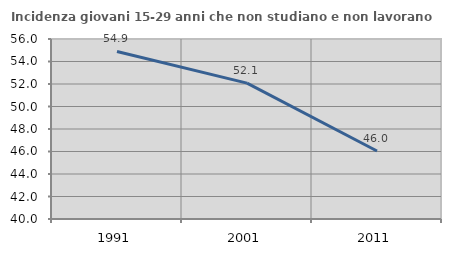
| Category | Incidenza giovani 15-29 anni che non studiano e non lavorano  |
|---|---|
| 1991.0 | 54.891 |
| 2001.0 | 52.08 |
| 2011.0 | 46.043 |